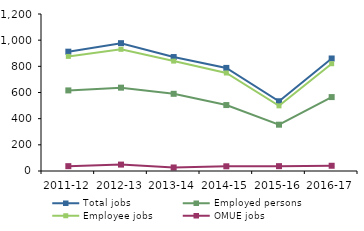
| Category | Total jobs | Employed persons | Employee jobs | OMUE jobs |
|---|---|---|---|---|
| 2011-12 | 912 | 616 | 876 | 37 |
| 2012-13 | 977 | 637 | 930 | 49 |
| 2013-14 | 871 | 590 | 840 | 27 |
| 2014-15 | 788 | 504 | 749 | 36 |
| 2015-16 | 533 | 354 | 498 | 37 |
| 2016-17 | 860 | 565 | 820 | 40 |